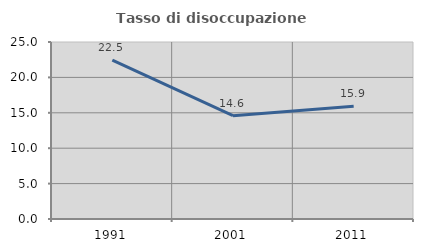
| Category | Tasso di disoccupazione giovanile  |
|---|---|
| 1991.0 | 22.453 |
| 2001.0 | 14.599 |
| 2011.0 | 15.936 |